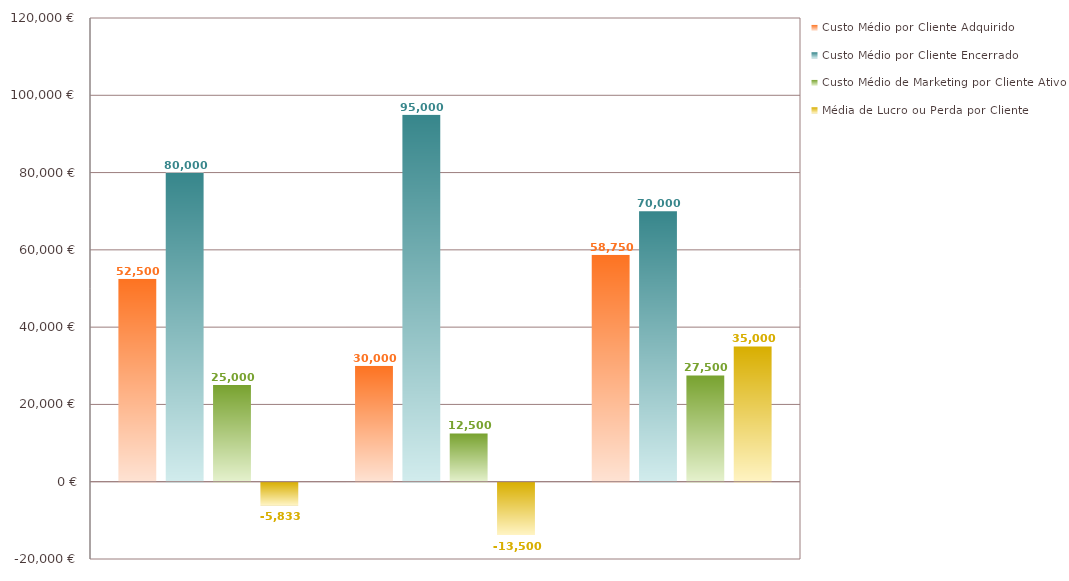
| Category | Custo Médio por Cliente Adquirido | Custo Médio por Cliente Encerrado | Custo Médio de Marketing por Cliente Ativo | Média de Lucro ou Perda por Cliente |
|---|---|---|---|---|
|  | 52500 | 80000 | 25000 | -5833.333 |
|  | 30000 | 95000 | 12500 | -13500 |
|  | 58750 | 70000 | 27500 | 35000 |